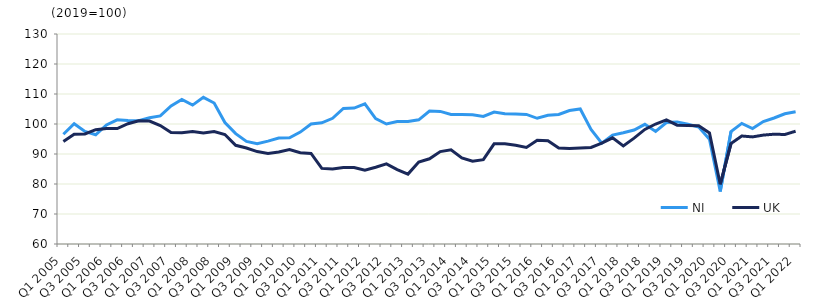
| Category | NI | UK  |
|---|---|---|
| Q1 2005 | 96.6 | 94.2 |
|  | 100.1 | 96.6 |
| Q3 2005 | 97.5 | 96.7 |
|  | 96.4 | 98.1 |
| Q1 2006 | 99.7 | 98.5 |
|  | 101.4 | 98.5 |
| Q3 2006 | 101.2 | 100.1 |
|  | 101.1 | 101.1 |
| Q1 2007 | 102.1 | 101 |
|  | 102.7 | 99.5 |
| Q3 2007 | 106 | 97.2 |
|  | 108.2 | 97.1 |
| Q1 2008 | 106.3 | 97.5 |
|  | 108.9 | 97 |
| Q3 2008 | 107 | 97.5 |
|  | 100.5 | 96.5 |
| Q1 2009 | 96.8 | 92.9 |
|  | 94.2 | 92 |
| Q3 2009 | 93.4 | 90.8 |
|  | 94.3 | 90.2 |
| Q1 2010 | 95.3 | 90.7 |
|  | 95.4 | 91.5 |
| Q3 2010 | 97.3 | 90.4 |
|  | 100 | 90.2 |
| Q1 2011 | 100.4 | 85.2 |
|  | 101.9 | 85 |
| Q3 2011 | 105.2 | 85.5 |
|  | 105.3 | 85.5 |
| Q1 2012 | 106.7 | 84.6 |
|  | 101.8 | 85.6 |
| Q3 2012 | 100 | 86.7 |
|  | 100.8 | 84.8 |
| Q1 2013 | 100.8 | 83.3 |
|  | 101.4 | 87.3 |
| Q3 2013 | 104.3 | 88.4 |
|  | 104.2 | 90.8 |
| Q1 2014 | 103.2 | 91.4 |
|  | 103.2 | 88.7 |
| Q3 2014 | 103.1 | 87.6 |
|  | 102.5 | 88.1 |
| Q1 2015 | 104 | 93.4 |
|  | 103.4 | 93.4 |
| Q3 2015 | 103.3 | 92.9 |
|  | 103.2 | 92.2 |
| Q1 2016 | 101.9 | 94.6 |
|  | 102.9 | 94.4 |
| Q3 2016 | 103.2 | 92 |
|  | 104.5 | 91.8 |
| Q1 2017 | 105 | 92 |
|  | 98.2 | 92.2 |
| Q3 2017 | 93.6 | 93.6 |
|  | 96.3 | 95.4 |
| Q1 2018 | 97.1 | 92.7 |
|  | 98 | 95.3 |
| Q3 2018 | 99.9 | 98.2 |
|  | 97.5 | 100 |
| Q1 2019 | 100.5 | 101.4 |
|  | 100.7 | 99.6 |
| Q3 2019 | 99.9 | 99.5 |
|  | 99 | 99.4 |
| Q1 2020 | 94.9 | 97 |
|  | 77.5 | 79.9 |
| Q3 2020 | 97.5 | 93.5 |
|  | 100.2 | 96 |
| Q1 2021 | 98.5 | 95.7 |
|  | 100.8 | 96.3 |
| Q3 2021 | 102 | 96.6 |
|  | 103.4 | 96.5 |
| Q1 2022 | 104.1 | 97.6 |